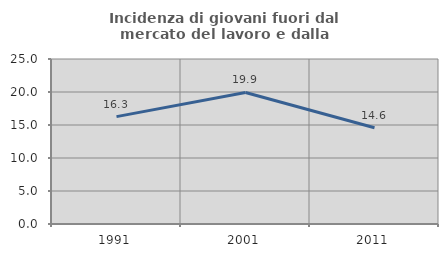
| Category | Incidenza di giovani fuori dal mercato del lavoro e dalla formazione  |
|---|---|
| 1991.0 | 16.265 |
| 2001.0 | 19.935 |
| 2011.0 | 14.576 |